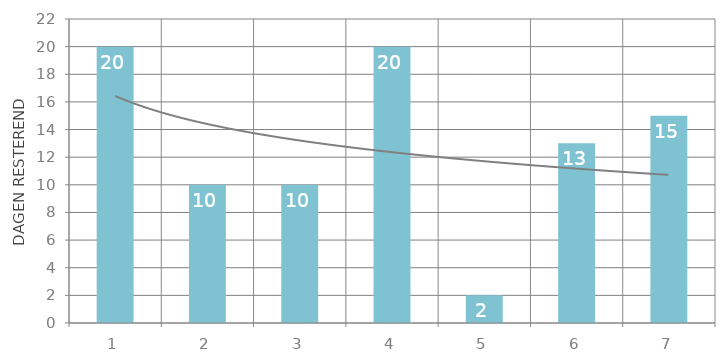
| Category | Totaal |
|---|---|
| 1 | 20 |
| 2 | 10 |
| 3 | 10 |
| 4 | 20 |
| 5 | 2 |
| 6 | 13 |
| 7 | 15 |